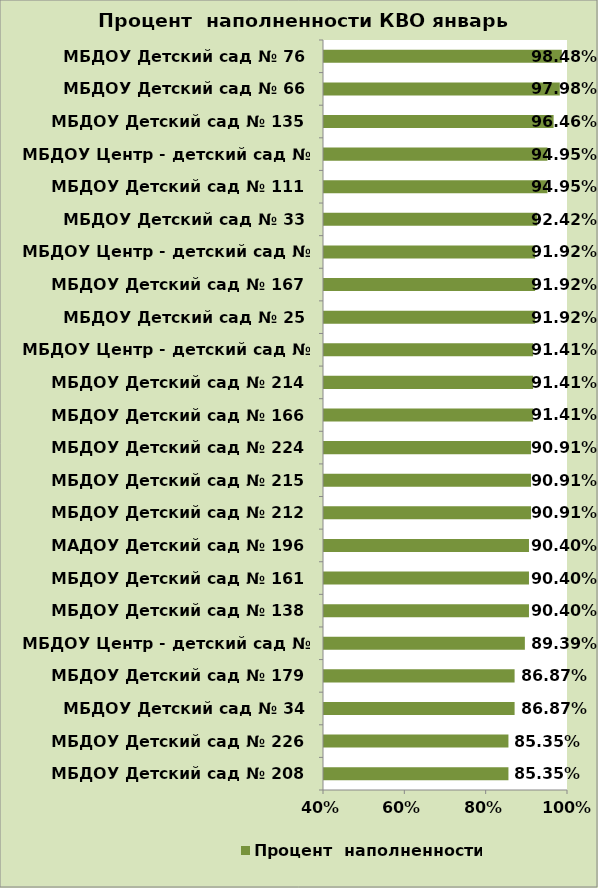
| Category | Процент  наполненности |
|---|---|
| МБДОУ Детский сад № 208 | 0.854 |
| МБДОУ Детский сад № 226 | 0.854 |
| МБДОУ Детский сад № 34 | 0.869 |
| МБДОУ Детский сад № 179 | 0.869 |
| МБДОУ Центр - детский сад № 201 | 0.894 |
| МБДОУ Детский сад № 138 | 0.904 |
| МБДОУ Детский сад № 161 | 0.904 |
| МАДОУ Детский сад № 196 | 0.904 |
| МБДОУ Детский сад № 212 | 0.909 |
| МБДОУ Детский сад № 215 | 0.909 |
| МБДОУ Детский сад № 224 | 0.909 |
| МБДОУ Детский сад № 166 | 0.914 |
| МБДОУ Детский сад № 214 | 0.914 |
| МБДОУ Центр - детский сад № 98 | 0.914 |
| МБДОУ Детский сад № 25 | 0.919 |
| МБДОУ Детский сад № 167 | 0.919 |
| МБДОУ Центр - детский сад № 131 | 0.919 |
| МБДОУ Детский сад № 33 | 0.924 |
| МБДОУ Детский сад № 111 | 0.949 |
| МБДОУ Центр - детский сад № 217 | 0.949 |
| МБДОУ Детский сад № 135 | 0.965 |
| МБДОУ Детский сад № 66 | 0.98 |
| МБДОУ Детский сад № 76 | 0.985 |